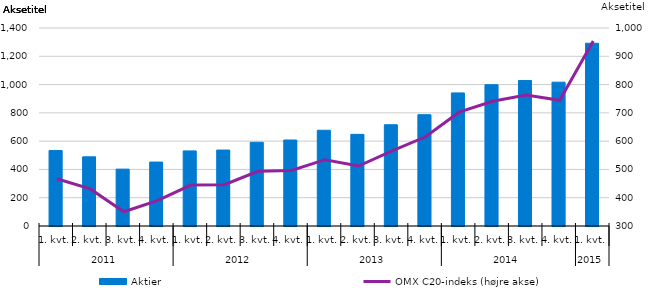
| Category | Aktier |
|---|---|
| 0 | 534 |
| 1 | 489 |
| 2 | 402 |
| 3 | 452 |
| 4 | 531 |
| 5 | 537 |
| 6 | 592 |
| 7 | 608 |
| 8 | 677 |
| 9 | 648 |
| 10 | 716 |
| 11 | 787 |
| 12 | 941 |
| 13 | 999 |
| 14 | 1029 |
| 15 | 1017 |
| 16 | 1292 |